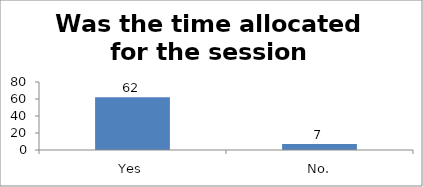
| Category | Was the time allocated for the session sufficient? |
|---|---|
| Yes | 62 |
| No. | 7 |